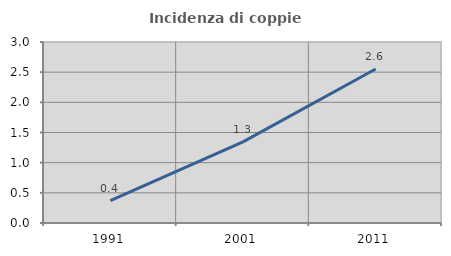
| Category | Incidenza di coppie miste |
|---|---|
| 1991.0 | 0.372 |
| 2001.0 | 1.345 |
| 2011.0 | 2.552 |